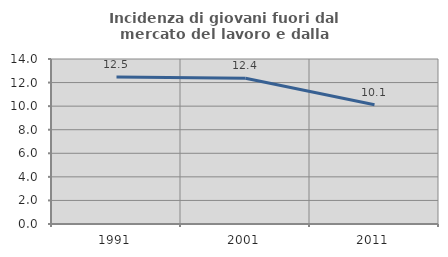
| Category | Incidenza di giovani fuori dal mercato del lavoro e dalla formazione  |
|---|---|
| 1991.0 | 12.472 |
| 2001.0 | 12.37 |
| 2011.0 | 10.111 |